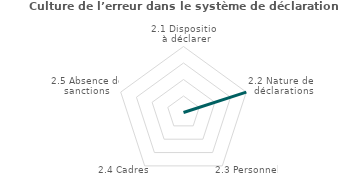
| Category | Series 2 |
|---|---|
| 2.1 Disposition à déclarer | 0 |
| 2.2 Nature des déclarations | 1 |
| 2.3 Personnel | 0 |
| 2.4 Cadres | 0 |
| 2.5 Absence de sanctions | 0 |